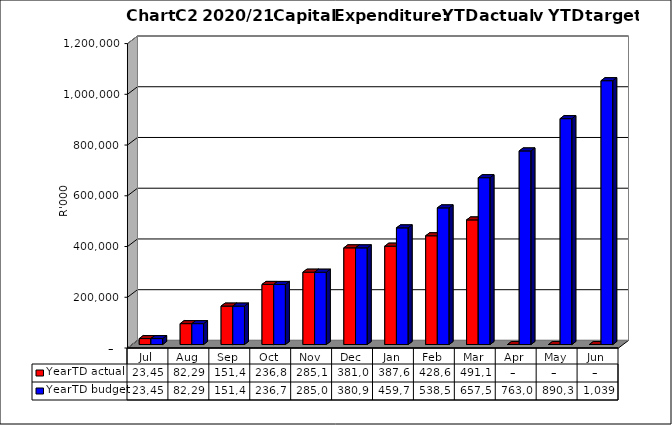
| Category | YearTD actual | YearTD budget |
|---|---|---|
| Jul | 23449713.35 | 23449713.353 |
| Aug | 82290541.22 | 82290541.222 |
| Sep | 151417435.55 | 151417435.557 |
| Oct | 236843117.22 | 236732057.814 |
| Nov | 285135887.03 | 285024827.634 |
| Dec | 381089801.33 | 380978741.757 |
| Jan | 387660571.188 | 459759496.134 |
| Feb | 428629264.217 | 538540239.449 |
| Mar | 491106390.019 | 657535142.431 |
| Apr | 0 | 763074825.564 |
| May | 0 | 890305443.132 |
| Jun | 0 | 1039881030.361 |